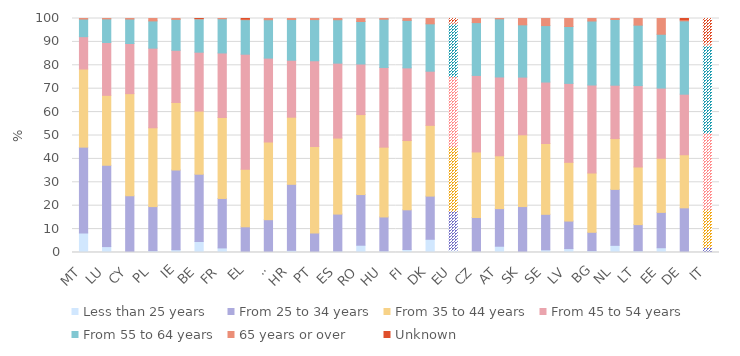
| Category | Less than 25 years | From 25 to 34 years | From 35 to 44 years | From 45 to 54 years | From 55 to 64 years | 65 years or over | Unknown |
|---|---|---|---|---|---|---|---|
| MT | 8.345 | 36.686 | 33.379 | 13.828 | 7.522 | 0.24 | 0 |
| LU | 2.527 | 34.759 | 29.878 | 22.579 | 10.085 | 0.173 | 0 |
| CY | 0.269 | 23.949 | 43.672 | 21.437 | 10.435 | 0.239 | 0 |
| PL | 0.771 | 18.846 | 33.68 | 34.033 | 11.644 | 1.027 | 0 |
| IE | 1.171 | 34.084 | 28.866 | 22.289 | 13.217 | 0.372 | 0 |
| BE | 4.703 | 28.75 | 26.98 | 25.172 | 14.206 | 0.184 | 0.005 |
| FR | 1.962 | 21.135 | 34.606 | 27.571 | 14.609 | 0.117 | 0 |
| EL | 0.148 | 10.827 | 24.644 | 49.121 | 14.759 | 0.258 | 0.243 |
| SI | 0.139 | 13.885 | 33.184 | 35.862 | 16.409 | 0.521 | 0 |
| HR | 0.922 | 28.217 | 28.679 | 24.344 | 17.393 | 0.445 | 0 |
| PT | 0.14 | 8.161 | 37.038 | 36.603 | 17.593 | 0.465 | 0 |
| ES | 0.57 | 15.845 | 32.487 | 32.017 | 18.559 | 0.522 | 0 |
| RO | 3.113 | 21.647 | 34.178 | 21.617 | 18.155 | 1.291 | 0 |
| HU | 0.652 | 14.537 | 29.833 | 34.05 | 20.617 | 0.311 | 0 |
| FI | 1.269 | 16.976 | 29.599 | 31.057 | 20.291 | 0.809 | 0 |
| DK | 5.653 | 18.451 | 30.234 | 23.141 | 20.249 | 2.273 | 0 |
| EU | 1.068 | 16.634 | 27.593 | 29.881 | 22.583 | 0.781 | 1.46 |
| CZ | 0.533 | 14.419 | 28.015 | 32.703 | 22.584 | 1.745 | 0 |
| AT | 2.686 | 16.066 | 22.573 | 33.687 | 24.841 | 0.147 | 0 |
| SK | 0.259 | 19.374 | 30.659 | 24.66 | 22.339 | 2.709 | 0 |
| SE | 1.152 | 15.161 | 30.263 | 26.268 | 24.125 | 3.031 | 0 |
| LV | 1.675 | 11.763 | 25.105 | 33.729 | 24.304 | 3.425 | 0 |
| BG | 0.8 | 7.841 | 25.315 | 37.628 | 27.347 | 1.068 | 0 |
| NL | 3.059 | 23.917 | 21.709 | 22.808 | 28.086 | 0.42 | 0 |
| LT | 0.699 | 11.208 | 24.635 | 34.787 | 25.837 | 2.835 | 0 |
| EE | 2.04 | 15.105 | 23.121 | 29.992 | 23.013 | 6.729 | 0 |
| DE | 0 | 19.086 | 22.686 | 25.885 | 31.345 | 0.486 | 0.512 |
| IT | 0.019 | 2.183 | 16.255 | 32.654 | 37.257 | 1.308 | 10.325 |